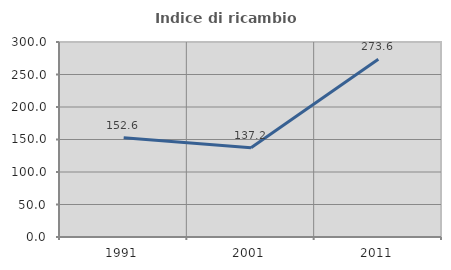
| Category | Indice di ricambio occupazionale  |
|---|---|
| 1991.0 | 152.604 |
| 2001.0 | 137.173 |
| 2011.0 | 273.585 |